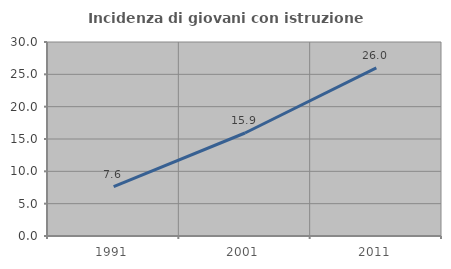
| Category | Incidenza di giovani con istruzione universitaria |
|---|---|
| 1991.0 | 7.643 |
| 2001.0 | 15.926 |
| 2011.0 | 25.984 |